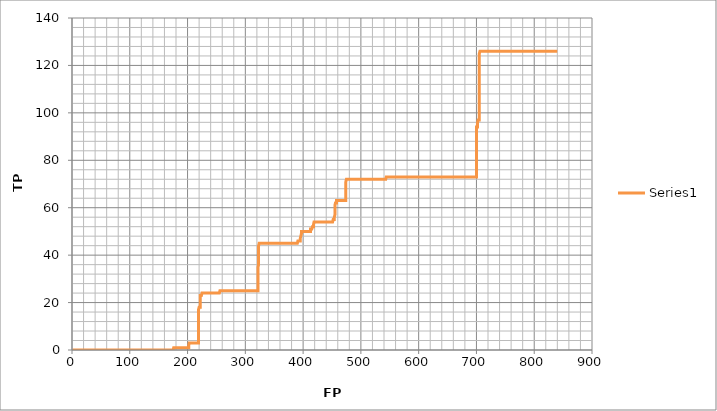
| Category | Series 0 |
|---|---|
| 840.0 | 126 |
| 839.0 | 126 |
| 838.0 | 126 |
| 837.0 | 126 |
| 836.0 | 126 |
| 835.0 | 126 |
| 834.0 | 126 |
| 833.0 | 126 |
| 832.0 | 126 |
| 831.0 | 126 |
| 830.0 | 126 |
| 829.0 | 126 |
| 828.0 | 126 |
| 827.0 | 126 |
| 826.0 | 126 |
| 825.0 | 126 |
| 824.0 | 126 |
| 823.0 | 126 |
| 822.0 | 126 |
| 821.0 | 126 |
| 820.0 | 126 |
| 819.0 | 126 |
| 818.0 | 126 |
| 817.0 | 126 |
| 816.0 | 126 |
| 815.0 | 126 |
| 814.0 | 126 |
| 813.0 | 126 |
| 812.0 | 126 |
| 811.0 | 126 |
| 810.0 | 126 |
| 809.0 | 126 |
| 808.0 | 126 |
| 807.0 | 126 |
| 806.0 | 126 |
| 805.0 | 126 |
| 804.0 | 126 |
| 803.0 | 126 |
| 802.0 | 126 |
| 801.0 | 126 |
| 800.0 | 126 |
| 799.0 | 126 |
| 798.0 | 126 |
| 797.0 | 126 |
| 796.0 | 126 |
| 795.0 | 126 |
| 794.0 | 126 |
| 793.0 | 126 |
| 792.0 | 126 |
| 791.0 | 126 |
| 790.0 | 126 |
| 789.0 | 126 |
| 788.0 | 126 |
| 787.0 | 126 |
| 786.0 | 126 |
| 785.0 | 126 |
| 784.0 | 126 |
| 783.0 | 126 |
| 782.0 | 126 |
| 781.0 | 126 |
| 780.0 | 126 |
| 779.0 | 126 |
| 778.0 | 126 |
| 777.0 | 126 |
| 776.0 | 126 |
| 775.0 | 126 |
| 774.0 | 126 |
| 773.0 | 126 |
| 772.0 | 126 |
| 771.0 | 126 |
| 770.0 | 126 |
| 769.0 | 126 |
| 768.0 | 126 |
| 767.0 | 126 |
| 766.0 | 126 |
| 765.0 | 126 |
| 764.0 | 126 |
| 763.0 | 126 |
| 762.0 | 126 |
| 761.0 | 126 |
| 760.0 | 126 |
| 759.0 | 126 |
| 758.0 | 126 |
| 757.0 | 126 |
| 756.0 | 126 |
| 755.0 | 126 |
| 754.0 | 126 |
| 753.0 | 126 |
| 752.0 | 126 |
| 751.0 | 126 |
| 750.0 | 126 |
| 749.0 | 126 |
| 748.0 | 126 |
| 747.0 | 126 |
| 746.0 | 126 |
| 745.0 | 126 |
| 744.0 | 126 |
| 743.0 | 126 |
| 742.0 | 126 |
| 741.0 | 126 |
| 740.0 | 126 |
| 739.0 | 126 |
| 738.0 | 126 |
| 737.0 | 126 |
| 736.0 | 126 |
| 735.0 | 126 |
| 734.0 | 126 |
| 733.0 | 126 |
| 732.0 | 126 |
| 731.0 | 126 |
| 730.0 | 126 |
| 729.0 | 126 |
| 728.0 | 126 |
| 727.0 | 126 |
| 726.0 | 126 |
| 725.0 | 126 |
| 724.0 | 126 |
| 723.0 | 126 |
| 722.0 | 126 |
| 721.0 | 126 |
| 720.0 | 126 |
| 719.0 | 126 |
| 718.0 | 126 |
| 717.0 | 126 |
| 716.0 | 126 |
| 715.0 | 126 |
| 714.0 | 126 |
| 713.0 | 126 |
| 712.0 | 126 |
| 711.0 | 126 |
| 710.0 | 126 |
| 709.0 | 126 |
| 708.0 | 126 |
| 707.0 | 126 |
| 706.0 | 126 |
| 705.0 | 126 |
| 705.0 | 125 |
| 705.0 | 124 |
| 705.0 | 123 |
| 705.0 | 122 |
| 705.0 | 121 |
| 705.0 | 120 |
| 705.0 | 119 |
| 705.0 | 118 |
| 705.0 | 117 |
| 705.0 | 116 |
| 705.0 | 115 |
| 705.0 | 114 |
| 705.0 | 113 |
| 705.0 | 112 |
| 705.0 | 111 |
| 705.0 | 110 |
| 705.0 | 109 |
| 705.0 | 108 |
| 705.0 | 107 |
| 705.0 | 106 |
| 705.0 | 105 |
| 705.0 | 104 |
| 705.0 | 103 |
| 705.0 | 102 |
| 705.0 | 101 |
| 705.0 | 100 |
| 705.0 | 99 |
| 705.0 | 98 |
| 705.0 | 97 |
| 704.0 | 97 |
| 703.0 | 97 |
| 702.0 | 97 |
| 702.0 | 96 |
| 702.0 | 95 |
| 702.0 | 94 |
| 701.0 | 94 |
| 700.0 | 94 |
| 700.0 | 93 |
| 700.0 | 92 |
| 700.0 | 91 |
| 700.0 | 90 |
| 700.0 | 89 |
| 700.0 | 88 |
| 700.0 | 87 |
| 700.0 | 86 |
| 700.0 | 85 |
| 700.0 | 84 |
| 700.0 | 83 |
| 700.0 | 82 |
| 700.0 | 81 |
| 700.0 | 80 |
| 700.0 | 79 |
| 700.0 | 78 |
| 700.0 | 77 |
| 700.0 | 76 |
| 700.0 | 75 |
| 700.0 | 74 |
| 700.0 | 73 |
| 699.0 | 73 |
| 698.0 | 73 |
| 697.0 | 73 |
| 696.0 | 73 |
| 695.0 | 73 |
| 694.0 | 73 |
| 693.0 | 73 |
| 692.0 | 73 |
| 691.0 | 73 |
| 690.0 | 73 |
| 689.0 | 73 |
| 688.0 | 73 |
| 687.0 | 73 |
| 686.0 | 73 |
| 685.0 | 73 |
| 684.0 | 73 |
| 683.0 | 73 |
| 682.0 | 73 |
| 681.0 | 73 |
| 680.0 | 73 |
| 679.0 | 73 |
| 678.0 | 73 |
| 677.0 | 73 |
| 676.0 | 73 |
| 675.0 | 73 |
| 674.0 | 73 |
| 673.0 | 73 |
| 672.0 | 73 |
| 671.0 | 73 |
| 670.0 | 73 |
| 669.0 | 73 |
| 668.0 | 73 |
| 667.0 | 73 |
| 666.0 | 73 |
| 665.0 | 73 |
| 664.0 | 73 |
| 663.0 | 73 |
| 662.0 | 73 |
| 661.0 | 73 |
| 660.0 | 73 |
| 659.0 | 73 |
| 658.0 | 73 |
| 657.0 | 73 |
| 656.0 | 73 |
| 655.0 | 73 |
| 654.0 | 73 |
| 653.0 | 73 |
| 652.0 | 73 |
| 651.0 | 73 |
| 650.0 | 73 |
| 649.0 | 73 |
| 648.0 | 73 |
| 647.0 | 73 |
| 646.0 | 73 |
| 645.0 | 73 |
| 644.0 | 73 |
| 643.0 | 73 |
| 642.0 | 73 |
| 641.0 | 73 |
| 640.0 | 73 |
| 639.0 | 73 |
| 638.0 | 73 |
| 637.0 | 73 |
| 636.0 | 73 |
| 635.0 | 73 |
| 634.0 | 73 |
| 633.0 | 73 |
| 632.0 | 73 |
| 631.0 | 73 |
| 630.0 | 73 |
| 629.0 | 73 |
| 628.0 | 73 |
| 627.0 | 73 |
| 626.0 | 73 |
| 625.0 | 73 |
| 624.0 | 73 |
| 623.0 | 73 |
| 622.0 | 73 |
| 621.0 | 73 |
| 620.0 | 73 |
| 619.0 | 73 |
| 618.0 | 73 |
| 617.0 | 73 |
| 616.0 | 73 |
| 615.0 | 73 |
| 614.0 | 73 |
| 613.0 | 73 |
| 612.0 | 73 |
| 611.0 | 73 |
| 610.0 | 73 |
| 609.0 | 73 |
| 608.0 | 73 |
| 607.0 | 73 |
| 606.0 | 73 |
| 605.0 | 73 |
| 604.0 | 73 |
| 603.0 | 73 |
| 602.0 | 73 |
| 601.0 | 73 |
| 600.0 | 73 |
| 599.0 | 73 |
| 598.0 | 73 |
| 597.0 | 73 |
| 596.0 | 73 |
| 595.0 | 73 |
| 594.0 | 73 |
| 593.0 | 73 |
| 592.0 | 73 |
| 591.0 | 73 |
| 590.0 | 73 |
| 589.0 | 73 |
| 588.0 | 73 |
| 587.0 | 73 |
| 586.0 | 73 |
| 585.0 | 73 |
| 584.0 | 73 |
| 583.0 | 73 |
| 582.0 | 73 |
| 581.0 | 73 |
| 580.0 | 73 |
| 579.0 | 73 |
| 578.0 | 73 |
| 577.0 | 73 |
| 576.0 | 73 |
| 575.0 | 73 |
| 574.0 | 73 |
| 573.0 | 73 |
| 572.0 | 73 |
| 571.0 | 73 |
| 570.0 | 73 |
| 569.0 | 73 |
| 568.0 | 73 |
| 567.0 | 73 |
| 566.0 | 73 |
| 565.0 | 73 |
| 564.0 | 73 |
| 563.0 | 73 |
| 562.0 | 73 |
| 561.0 | 73 |
| 560.0 | 73 |
| 559.0 | 73 |
| 558.0 | 73 |
| 557.0 | 73 |
| 556.0 | 73 |
| 555.0 | 73 |
| 554.0 | 73 |
| 553.0 | 73 |
| 552.0 | 73 |
| 551.0 | 73 |
| 550.0 | 73 |
| 549.0 | 73 |
| 548.0 | 73 |
| 547.0 | 73 |
| 546.0 | 73 |
| 545.0 | 73 |
| 544.0 | 73 |
| 543.0 | 73 |
| 543.0 | 72 |
| 542.0 | 72 |
| 541.0 | 72 |
| 540.0 | 72 |
| 539.0 | 72 |
| 538.0 | 72 |
| 537.0 | 72 |
| 536.0 | 72 |
| 535.0 | 72 |
| 534.0 | 72 |
| 533.0 | 72 |
| 532.0 | 72 |
| 531.0 | 72 |
| 530.0 | 72 |
| 529.0 | 72 |
| 528.0 | 72 |
| 527.0 | 72 |
| 526.0 | 72 |
| 525.0 | 72 |
| 524.0 | 72 |
| 523.0 | 72 |
| 522.0 | 72 |
| 521.0 | 72 |
| 520.0 | 72 |
| 519.0 | 72 |
| 518.0 | 72 |
| 517.0 | 72 |
| 516.0 | 72 |
| 515.0 | 72 |
| 514.0 | 72 |
| 513.0 | 72 |
| 512.0 | 72 |
| 511.0 | 72 |
| 510.0 | 72 |
| 509.0 | 72 |
| 508.0 | 72 |
| 507.0 | 72 |
| 506.0 | 72 |
| 505.0 | 72 |
| 504.0 | 72 |
| 503.0 | 72 |
| 502.0 | 72 |
| 501.0 | 72 |
| 500.0 | 72 |
| 499.0 | 72 |
| 498.0 | 72 |
| 497.0 | 72 |
| 496.0 | 72 |
| 495.0 | 72 |
| 494.0 | 72 |
| 493.0 | 72 |
| 492.0 | 72 |
| 491.0 | 72 |
| 490.0 | 72 |
| 489.0 | 72 |
| 488.0 | 72 |
| 487.0 | 72 |
| 486.0 | 72 |
| 485.0 | 72 |
| 484.0 | 72 |
| 483.0 | 72 |
| 482.0 | 72 |
| 481.0 | 72 |
| 480.0 | 72 |
| 479.0 | 72 |
| 478.0 | 72 |
| 477.0 | 72 |
| 476.0 | 72 |
| 475.0 | 72 |
| 474.0 | 72 |
| 474.0 | 71 |
| 474.0 | 70 |
| 474.0 | 69 |
| 474.0 | 68 |
| 474.0 | 67 |
| 474.0 | 66 |
| 474.0 | 65 |
| 474.0 | 64 |
| 474.0 | 63 |
| 473.0 | 63 |
| 472.0 | 63 |
| 471.0 | 63 |
| 470.0 | 63 |
| 469.0 | 63 |
| 468.0 | 63 |
| 467.0 | 63 |
| 466.0 | 63 |
| 465.0 | 63 |
| 464.0 | 63 |
| 463.0 | 63 |
| 462.0 | 63 |
| 461.0 | 63 |
| 460.0 | 63 |
| 459.0 | 63 |
| 458.0 | 63 |
| 458.0 | 62 |
| 457.0 | 62 |
| 456.0 | 62 |
| 455.0 | 62 |
| 455.0 | 61 |
| 455.0 | 60 |
| 455.0 | 59 |
| 455.0 | 58 |
| 455.0 | 57 |
| 454.0 | 57 |
| 454.0 | 56 |
| 454.0 | 55 |
| 453.0 | 55 |
| 452.0 | 55 |
| 451.0 | 55 |
| 451.0 | 54 |
| 450.0 | 54 |
| 449.0 | 54 |
| 448.0 | 54 |
| 447.0 | 54 |
| 446.0 | 54 |
| 445.0 | 54 |
| 444.0 | 54 |
| 443.0 | 54 |
| 442.0 | 54 |
| 441.0 | 54 |
| 440.0 | 54 |
| 439.0 | 54 |
| 438.0 | 54 |
| 437.0 | 54 |
| 436.0 | 54 |
| 435.0 | 54 |
| 434.0 | 54 |
| 433.0 | 54 |
| 432.0 | 54 |
| 431.0 | 54 |
| 430.0 | 54 |
| 429.0 | 54 |
| 428.0 | 54 |
| 427.0 | 54 |
| 426.0 | 54 |
| 425.0 | 54 |
| 424.0 | 54 |
| 423.0 | 54 |
| 422.0 | 54 |
| 421.0 | 54 |
| 420.0 | 54 |
| 419.0 | 54 |
| 418.0 | 54 |
| 418.0 | 53 |
| 418.0 | 52 |
| 417.0 | 52 |
| 416.0 | 52 |
| 415.0 | 52 |
| 415.0 | 51 |
| 414.0 | 51 |
| 413.0 | 51 |
| 413.0 | 50 |
| 412.0 | 50 |
| 411.0 | 50 |
| 410.0 | 50 |
| 409.0 | 50 |
| 408.0 | 50 |
| 407.0 | 50 |
| 406.0 | 50 |
| 405.0 | 50 |
| 404.0 | 50 |
| 403.0 | 50 |
| 402.0 | 50 |
| 401.0 | 50 |
| 400.0 | 50 |
| 399.0 | 50 |
| 398.0 | 50 |
| 397.0 | 50 |
| 397.0 | 49 |
| 396.0 | 49 |
| 396.0 | 48 |
| 395.0 | 48 |
| 395.0 | 47 |
| 395.0 | 46 |
| 394.0 | 46 |
| 393.0 | 46 |
| 392.0 | 46 |
| 391.0 | 46 |
| 390.0 | 46 |
| 390.0 | 45 |
| 389.0 | 45 |
| 388.0 | 45 |
| 387.0 | 45 |
| 386.0 | 45 |
| 385.0 | 45 |
| 384.0 | 45 |
| 383.0 | 45 |
| 382.0 | 45 |
| 381.0 | 45 |
| 380.0 | 45 |
| 379.0 | 45 |
| 378.0 | 45 |
| 377.0 | 45 |
| 376.0 | 45 |
| 375.0 | 45 |
| 374.0 | 45 |
| 373.0 | 45 |
| 372.0 | 45 |
| 371.0 | 45 |
| 370.0 | 45 |
| 369.0 | 45 |
| 368.0 | 45 |
| 367.0 | 45 |
| 366.0 | 45 |
| 365.0 | 45 |
| 364.0 | 45 |
| 363.0 | 45 |
| 362.0 | 45 |
| 361.0 | 45 |
| 360.0 | 45 |
| 359.0 | 45 |
| 358.0 | 45 |
| 357.0 | 45 |
| 356.0 | 45 |
| 355.0 | 45 |
| 354.0 | 45 |
| 353.0 | 45 |
| 352.0 | 45 |
| 351.0 | 45 |
| 350.0 | 45 |
| 349.0 | 45 |
| 348.0 | 45 |
| 347.0 | 45 |
| 346.0 | 45 |
| 345.0 | 45 |
| 344.0 | 45 |
| 343.0 | 45 |
| 342.0 | 45 |
| 341.0 | 45 |
| 340.0 | 45 |
| 339.0 | 45 |
| 338.0 | 45 |
| 337.0 | 45 |
| 336.0 | 45 |
| 335.0 | 45 |
| 334.0 | 45 |
| 333.0 | 45 |
| 332.0 | 45 |
| 331.0 | 45 |
| 330.0 | 45 |
| 329.0 | 45 |
| 328.0 | 45 |
| 327.0 | 45 |
| 326.0 | 45 |
| 325.0 | 45 |
| 324.0 | 45 |
| 323.0 | 45 |
| 323.0 | 44 |
| 323.0 | 43 |
| 323.0 | 42 |
| 323.0 | 41 |
| 323.0 | 40 |
| 323.0 | 39 |
| 323.0 | 38 |
| 323.0 | 37 |
| 323.0 | 36 |
| 322.0 | 36 |
| 322.0 | 35 |
| 322.0 | 34 |
| 322.0 | 33 |
| 322.0 | 32 |
| 322.0 | 31 |
| 322.0 | 30 |
| 322.0 | 29 |
| 322.0 | 28 |
| 322.0 | 27 |
| 322.0 | 26 |
| 322.0 | 25 |
| 321.0 | 25 |
| 320.0 | 25 |
| 319.0 | 25 |
| 318.0 | 25 |
| 317.0 | 25 |
| 316.0 | 25 |
| 315.0 | 25 |
| 314.0 | 25 |
| 313.0 | 25 |
| 312.0 | 25 |
| 311.0 | 25 |
| 310.0 | 25 |
| 309.0 | 25 |
| 308.0 | 25 |
| 307.0 | 25 |
| 306.0 | 25 |
| 305.0 | 25 |
| 304.0 | 25 |
| 303.0 | 25 |
| 302.0 | 25 |
| 301.0 | 25 |
| 300.0 | 25 |
| 299.0 | 25 |
| 298.0 | 25 |
| 297.0 | 25 |
| 296.0 | 25 |
| 295.0 | 25 |
| 294.0 | 25 |
| 293.0 | 25 |
| 292.0 | 25 |
| 291.0 | 25 |
| 290.0 | 25 |
| 289.0 | 25 |
| 288.0 | 25 |
| 287.0 | 25 |
| 286.0 | 25 |
| 285.0 | 25 |
| 284.0 | 25 |
| 283.0 | 25 |
| 282.0 | 25 |
| 281.0 | 25 |
| 280.0 | 25 |
| 279.0 | 25 |
| 278.0 | 25 |
| 277.0 | 25 |
| 276.0 | 25 |
| 275.0 | 25 |
| 274.0 | 25 |
| 273.0 | 25 |
| 272.0 | 25 |
| 271.0 | 25 |
| 270.0 | 25 |
| 269.0 | 25 |
| 268.0 | 25 |
| 267.0 | 25 |
| 266.0 | 25 |
| 265.0 | 25 |
| 264.0 | 25 |
| 263.0 | 25 |
| 262.0 | 25 |
| 261.0 | 25 |
| 260.0 | 25 |
| 259.0 | 25 |
| 258.0 | 25 |
| 257.0 | 25 |
| 256.0 | 25 |
| 255.0 | 25 |
| 255.0 | 24 |
| 254.0 | 24 |
| 253.0 | 24 |
| 252.0 | 24 |
| 251.0 | 24 |
| 250.0 | 24 |
| 249.0 | 24 |
| 248.0 | 24 |
| 247.0 | 24 |
| 246.0 | 24 |
| 245.0 | 24 |
| 244.0 | 24 |
| 243.0 | 24 |
| 242.0 | 24 |
| 241.0 | 24 |
| 240.0 | 24 |
| 239.0 | 24 |
| 238.0 | 24 |
| 237.0 | 24 |
| 236.0 | 24 |
| 235.0 | 24 |
| 234.0 | 24 |
| 233.0 | 24 |
| 232.0 | 24 |
| 231.0 | 24 |
| 230.0 | 24 |
| 229.0 | 24 |
| 228.0 | 24 |
| 227.0 | 24 |
| 226.0 | 24 |
| 225.0 | 24 |
| 224.0 | 24 |
| 224.0 | 23 |
| 223.0 | 23 |
| 222.0 | 23 |
| 222.0 | 22 |
| 222.0 | 21 |
| 222.0 | 20 |
| 222.0 | 19 |
| 222.0 | 18 |
| 221.0 | 18 |
| 220.0 | 18 |
| 219.0 | 18 |
| 219.0 | 17 |
| 219.0 | 16 |
| 219.0 | 15 |
| 219.0 | 14 |
| 219.0 | 13 |
| 219.0 | 12 |
| 219.0 | 11 |
| 219.0 | 10 |
| 219.0 | 9 |
| 219.0 | 8 |
| 219.0 | 7 |
| 219.0 | 6 |
| 219.0 | 5 |
| 219.0 | 4 |
| 219.0 | 3 |
| 218.0 | 3 |
| 217.0 | 3 |
| 216.0 | 3 |
| 215.0 | 3 |
| 214.0 | 3 |
| 213.0 | 3 |
| 212.0 | 3 |
| 211.0 | 3 |
| 210.0 | 3 |
| 209.0 | 3 |
| 208.0 | 3 |
| 207.0 | 3 |
| 206.0 | 3 |
| 205.0 | 3 |
| 204.0 | 3 |
| 203.0 | 3 |
| 202.0 | 3 |
| 202.0 | 2 |
| 202.0 | 1 |
| 201.0 | 1 |
| 200.0 | 1 |
| 199.0 | 1 |
| 198.0 | 1 |
| 197.0 | 1 |
| 196.0 | 1 |
| 195.0 | 1 |
| 194.0 | 1 |
| 193.0 | 1 |
| 192.0 | 1 |
| 191.0 | 1 |
| 190.0 | 1 |
| 189.0 | 1 |
| 188.0 | 1 |
| 187.0 | 1 |
| 186.0 | 1 |
| 185.0 | 1 |
| 184.0 | 1 |
| 183.0 | 1 |
| 182.0 | 1 |
| 181.0 | 1 |
| 180.0 | 1 |
| 179.0 | 1 |
| 178.0 | 1 |
| 177.0 | 1 |
| 176.0 | 1 |
| 175.0 | 1 |
| 175.0 | 0 |
| 174.0 | 0 |
| 173.0 | 0 |
| 172.0 | 0 |
| 171.0 | 0 |
| 170.0 | 0 |
| 169.0 | 0 |
| 168.0 | 0 |
| 167.0 | 0 |
| 166.0 | 0 |
| 165.0 | 0 |
| 164.0 | 0 |
| 163.0 | 0 |
| 162.0 | 0 |
| 161.0 | 0 |
| 160.0 | 0 |
| 159.0 | 0 |
| 158.0 | 0 |
| 157.0 | 0 |
| 156.0 | 0 |
| 155.0 | 0 |
| 154.0 | 0 |
| 153.0 | 0 |
| 152.0 | 0 |
| 151.0 | 0 |
| 150.0 | 0 |
| 149.0 | 0 |
| 148.0 | 0 |
| 147.0 | 0 |
| 146.0 | 0 |
| 145.0 | 0 |
| 144.0 | 0 |
| 143.0 | 0 |
| 142.0 | 0 |
| 141.0 | 0 |
| 140.0 | 0 |
| 139.0 | 0 |
| 138.0 | 0 |
| 137.0 | 0 |
| 136.0 | 0 |
| 135.0 | 0 |
| 134.0 | 0 |
| 133.0 | 0 |
| 132.0 | 0 |
| 131.0 | 0 |
| 130.0 | 0 |
| 129.0 | 0 |
| 128.0 | 0 |
| 127.0 | 0 |
| 126.0 | 0 |
| 125.0 | 0 |
| 124.0 | 0 |
| 123.0 | 0 |
| 122.0 | 0 |
| 121.0 | 0 |
| 120.0 | 0 |
| 119.0 | 0 |
| 118.0 | 0 |
| 117.0 | 0 |
| 116.0 | 0 |
| 115.0 | 0 |
| 114.0 | 0 |
| 113.0 | 0 |
| 112.0 | 0 |
| 111.0 | 0 |
| 110.0 | 0 |
| 109.0 | 0 |
| 108.0 | 0 |
| 107.0 | 0 |
| 106.0 | 0 |
| 105.0 | 0 |
| 104.0 | 0 |
| 103.0 | 0 |
| 102.0 | 0 |
| 101.0 | 0 |
| 100.0 | 0 |
| 99.0 | 0 |
| 98.0 | 0 |
| 97.0 | 0 |
| 96.0 | 0 |
| 95.0 | 0 |
| 94.0 | 0 |
| 93.0 | 0 |
| 92.0 | 0 |
| 91.0 | 0 |
| 90.0 | 0 |
| 89.0 | 0 |
| 88.0 | 0 |
| 87.0 | 0 |
| 86.0 | 0 |
| 85.0 | 0 |
| 84.0 | 0 |
| 83.0 | 0 |
| 82.0 | 0 |
| 81.0 | 0 |
| 80.0 | 0 |
| 79.0 | 0 |
| 78.0 | 0 |
| 77.0 | 0 |
| 76.0 | 0 |
| 75.0 | 0 |
| 74.0 | 0 |
| 73.0 | 0 |
| 72.0 | 0 |
| 71.0 | 0 |
| 70.0 | 0 |
| 69.0 | 0 |
| 68.0 | 0 |
| 67.0 | 0 |
| 66.0 | 0 |
| 65.0 | 0 |
| 64.0 | 0 |
| 63.0 | 0 |
| 62.0 | 0 |
| 61.0 | 0 |
| 60.0 | 0 |
| 59.0 | 0 |
| 58.0 | 0 |
| 57.0 | 0 |
| 56.0 | 0 |
| 55.0 | 0 |
| 54.0 | 0 |
| 53.0 | 0 |
| 52.0 | 0 |
| 51.0 | 0 |
| 50.0 | 0 |
| 49.0 | 0 |
| 48.0 | 0 |
| 47.0 | 0 |
| 46.0 | 0 |
| 45.0 | 0 |
| 44.0 | 0 |
| 43.0 | 0 |
| 42.0 | 0 |
| 41.0 | 0 |
| 40.0 | 0 |
| 39.0 | 0 |
| 38.0 | 0 |
| 37.0 | 0 |
| 36.0 | 0 |
| 35.0 | 0 |
| 34.0 | 0 |
| 33.0 | 0 |
| 32.0 | 0 |
| 31.0 | 0 |
| 30.0 | 0 |
| 29.0 | 0 |
| 28.0 | 0 |
| 27.0 | 0 |
| 26.0 | 0 |
| 25.0 | 0 |
| 24.0 | 0 |
| 23.0 | 0 |
| 22.0 | 0 |
| 21.0 | 0 |
| 20.0 | 0 |
| 19.0 | 0 |
| 18.0 | 0 |
| 17.0 | 0 |
| 16.0 | 0 |
| 15.0 | 0 |
| 14.0 | 0 |
| 13.0 | 0 |
| 12.0 | 0 |
| 11.0 | 0 |
| 10.0 | 0 |
| 9.0 | 0 |
| 8.0 | 0 |
| 7.0 | 0 |
| 6.0 | 0 |
| 5.0 | 0 |
| 4.0 | 0 |
| 3.0 | 0 |
| 2.0 | 0 |
| 1.0 | 0 |